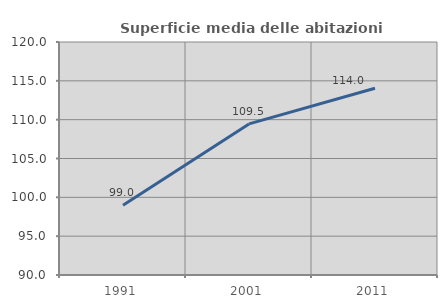
| Category | Superficie media delle abitazioni occupate |
|---|---|
| 1991.0 | 98.978 |
| 2001.0 | 109.456 |
| 2011.0 | 114.037 |